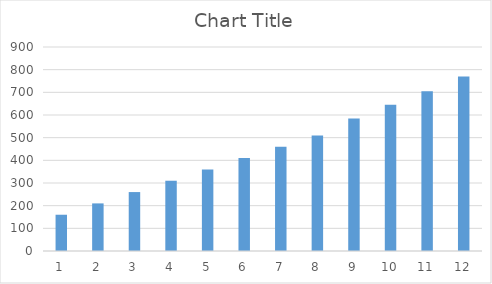
| Category | Series 0 |
|---|---|
| 0 | 160 |
| 1 | 210 |
| 2 | 260 |
| 3 | 310 |
| 4 | 360 |
| 5 | 410 |
| 6 | 460 |
| 7 | 510 |
| 8 | 585 |
| 9 | 645 |
| 10 | 705 |
| 11 | 770 |